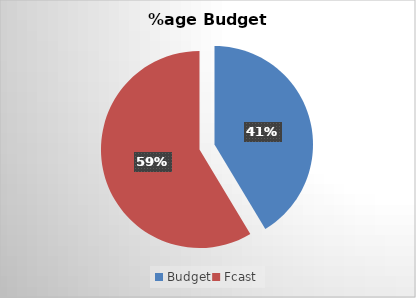
| Category | Series 0 |
|---|---|
| Budget | 1034.381 |
| Fcast | 1465.619 |